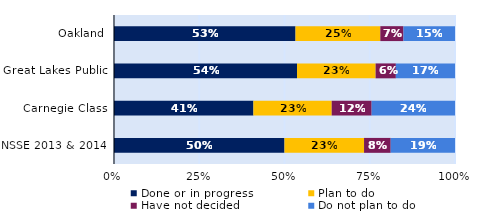
| Category | Done or in progress | Plan to do | Have not decided | Do not plan to do |
|---|---|---|---|---|
| Oakland | 0.532 | 0.249 | 0.068 | 0.151 |
| Great Lakes Public | 0.537 | 0.23 | 0.059 | 0.173 |
| Carnegie Class | 0.409 | 0.23 | 0.117 | 0.244 |
| NSSE 2013 & 2014 | 0.5 | 0.233 | 0.078 | 0.189 |